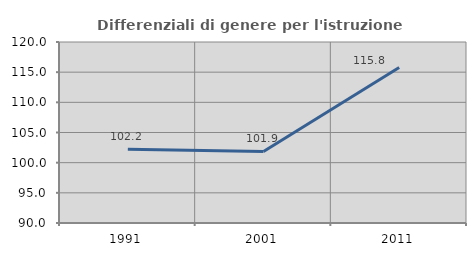
| Category | Differenziali di genere per l'istruzione superiore |
|---|---|
| 1991.0 | 102.22 |
| 2001.0 | 101.867 |
| 2011.0 | 115.767 |